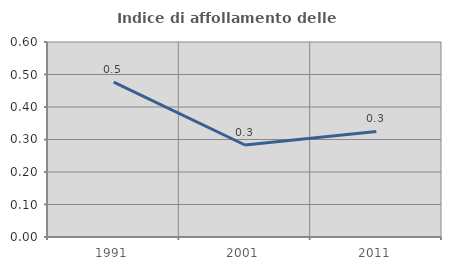
| Category | Indice di affollamento delle abitazioni  |
|---|---|
| 1991.0 | 0.476 |
| 2001.0 | 0.283 |
| 2011.0 | 0.325 |